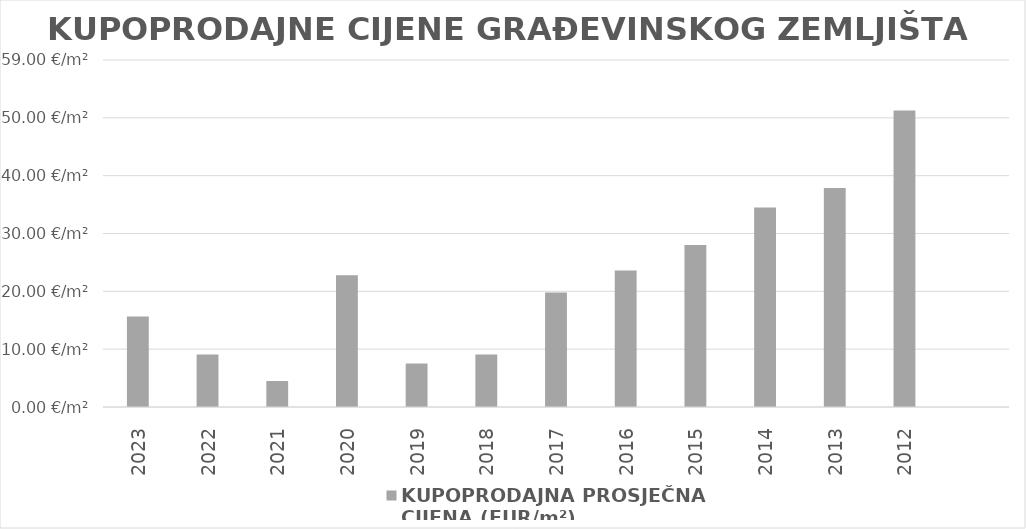
| Category | KUPOPRODAJNA PROSJEČNA 
CIJENA (EUR/m²) |
|---|---|
| 2023 | 1900-01-15 15:43:19 |
| 2022 | 1900-01-09 01:57:06 |
| 2021 | 1900-01-04 11:54:52 |
| 2020 | 1900-01-22 19:04:46 |
| 2019 | 1900-01-07 12:25:10 |
| 2018 | 1900-01-09 02:14:44 |
| 2017 | 1900-01-19 19:02:52 |
| 2016 | 1900-01-23 14:13:55 |
| 2015 | 1900-01-27 23:46:08 |
| 2014 | 1900-02-03 12:13:15 |
| 2013 | 1900-02-06 20:21:43 |
| 2012 | 1900-02-20 06:11:59 |